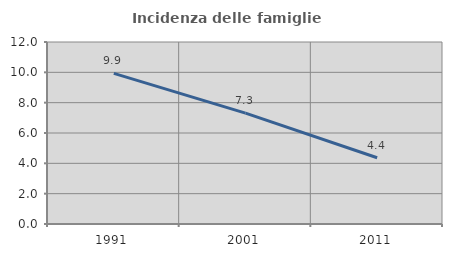
| Category | Incidenza delle famiglie numerose |
|---|---|
| 1991.0 | 9.932 |
| 2001.0 | 7.309 |
| 2011.0 | 4.369 |